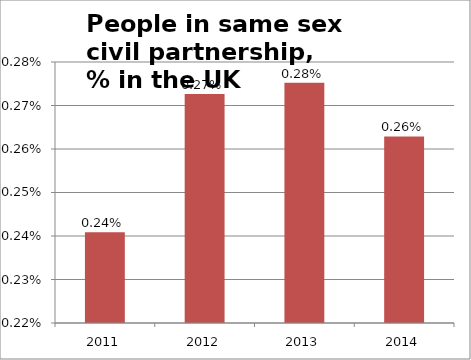
| Category | Series 1 |
|---|---|
| 2011.0 | 0.002 |
| 2012.0 | 0.003 |
| 2013.0 | 0.003 |
| 2014.0 | 0.003 |